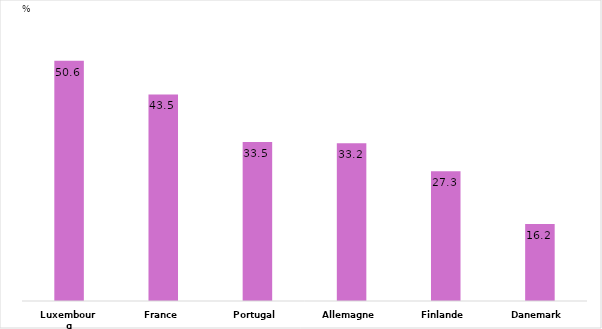
| Category | Series 0 |
|---|---|
| Luxembourg | 50.6 |
| France | 43.5 |
| Portugal | 33.5 |
| Allemagne | 33.2 |
| Finlande | 27.3 |
| Danemark | 16.2 |